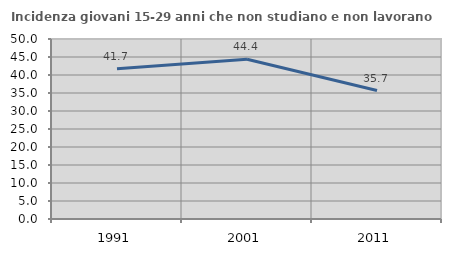
| Category | Incidenza giovani 15-29 anni che non studiano e non lavorano  |
|---|---|
| 1991.0 | 41.706 |
| 2001.0 | 44.377 |
| 2011.0 | 35.671 |